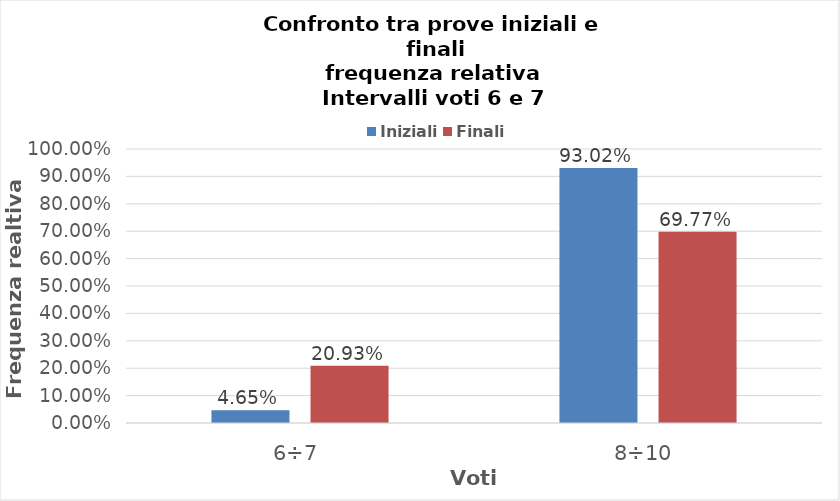
| Category | Iniziali | Finali |
|---|---|---|
| 6÷7 | 0.047 | 0.209 |
| 8÷10 | 0.93 | 0.698 |